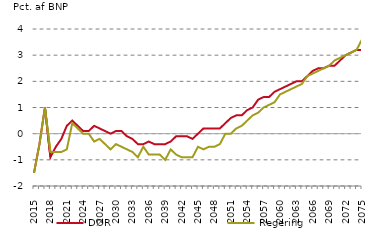
| Category | nul-linje | DØR | Regering |
|---|---|---|---|
| 2015.0 | 0 | -1.5 | -1.5 |
| 2016.0 | 0 | -0.4 | -0.4 |
| 2017.0 | 0 | 1 | 1 |
| 2018.0 | 0 | -0.9 | -0.7 |
| 2019.0 | 0 | -0.5 | -0.7 |
| 2020.0 | 0 | -0.2 | -0.7 |
| 2021.0 | 0 | 0.3 | -0.6 |
| 2022.0 | 0 | 0.5 | 0.4 |
| 2023.0 | 0 | 0.3 | 0.2 |
| 2024.0 | 0 | 0.1 | 0 |
| 2025.0 | 0 | 0.1 | 0 |
| 2026.0 | 0 | 0.3 | -0.3 |
| 2027.0 | 0 | 0.2 | -0.2 |
| 2028.0 | 0 | 0.1 | -0.4 |
| 2029.0 | 0 | 0 | -0.6 |
| 2030.0 | 0 | 0.1 | -0.4 |
| 2031.0 | 0 | 0.1 | -0.5 |
| 2032.0 | 0 | -0.1 | -0.6 |
| 2033.0 | 0 | -0.2 | -0.7 |
| 2034.0 | 0 | -0.4 | -0.9 |
| 2035.0 | 0 | -0.4 | -0.5 |
| 2036.0 | 0 | -0.3 | -0.8 |
| 2037.0 | 0 | -0.4 | -0.8 |
| 2038.0 | 0 | -0.4 | -0.8 |
| 2039.0 | 0 | -0.4 | -1 |
| 2040.0 | 0 | -0.3 | -0.6 |
| 2041.0 | 0 | -0.1 | -0.8 |
| 2042.0 | 0 | -0.1 | -0.9 |
| 2043.0 | 0 | -0.1 | -0.9 |
| 2044.0 | 0 | -0.2 | -0.9 |
| 2045.0 | 0 | 0 | -0.5 |
| 2046.0 | 0 | 0.2 | -0.6 |
| 2047.0 | 0 | 0.2 | -0.5 |
| 2048.0 | 0 | 0.2 | -0.5 |
| 2049.0 | 0 | 0.2 | -0.4 |
| 2050.0 | 0 | 0.4 | 0 |
| 2051.0 | 0 | 0.6 | 0 |
| 2052.0 | 0 | 0.7 | 0.2 |
| 2053.0 | 0 | 0.7 | 0.3 |
| 2054.0 | 0 | 0.9 | 0.5 |
| 2055.0 | 0 | 1 | 0.7 |
| 2056.0 | 0 | 1.3 | 0.8 |
| 2057.0 | 0 | 1.4 | 1 |
| 2058.0 | 0 | 1.4 | 1.1 |
| 2059.0 | 0 | 1.6 | 1.2 |
| 2060.0 | 0 | 1.7 | 1.5 |
| 2061.0 | 0 | 1.8 | 1.6 |
| 2062.0 | 0 | 1.9 | 1.7 |
| 2063.0 | 0 | 2 | 1.8 |
| 2064.0 | 0 | 2 | 1.9 |
| 2065.0 | 0 | 2.2 | 2.2 |
| 2066.0 | 0 | 2.4 | 2.3 |
| 2067.0 | 0 | 2.5 | 2.4 |
| 2068.0 | 0 | 2.5 | 2.5 |
| 2069.0 | 0 | 2.6 | 2.6 |
| 2070.0 | 0 | 2.6 | 2.8 |
| 2071.0 | 0 | 2.8 | 2.9 |
| 2072.0 | 0 | 3 | 3 |
| 2073.0 | 0 | 3.1 | 3.1 |
| 2074.0 | 0 | 3.2 | 3.2 |
| 2075.0 | 0 | 3.2 | 3.6 |